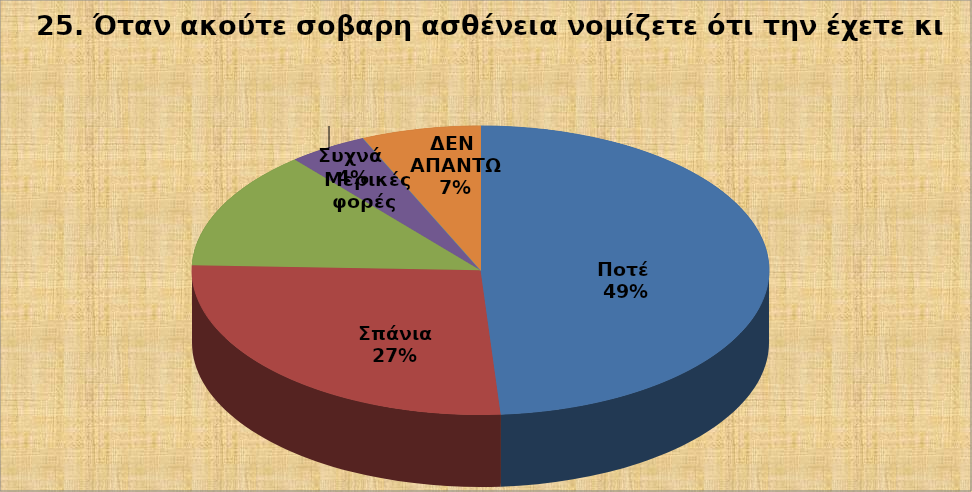
| Category | Series 0 |
|---|---|
| Ποτέ  | 22 |
| Σπάνια  | 12 |
| Μερικές φορές  | 6 |
| Συχνά  | 2 |
| Συνήθως  | 0 |
| ΔΕΝ ΑΠΑΝΤΩ | 3 |